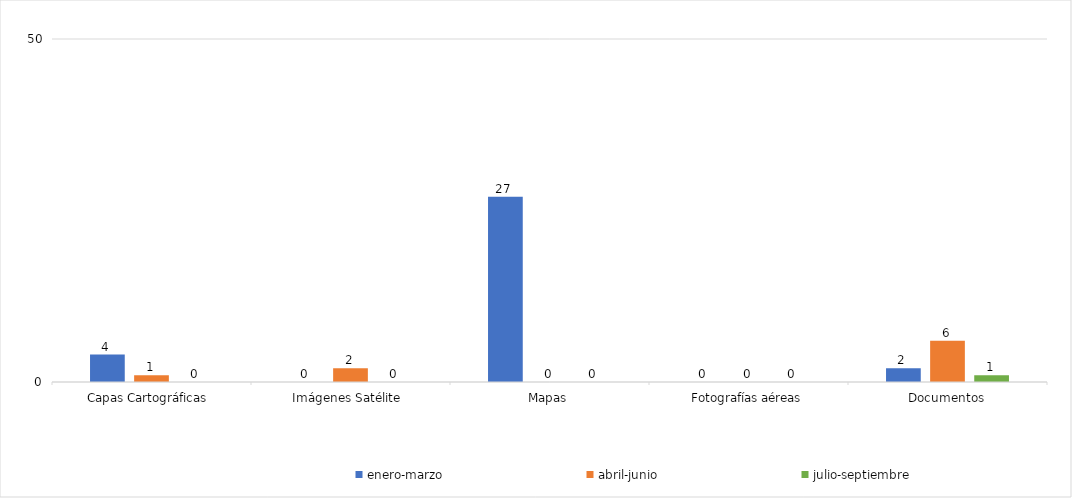
| Category | enero-marzo | abril-junio | julio-septiembre | Series 3 |
|---|---|---|---|---|
| Capas Cartográficas  | 4 | 1 | 0 |  |
| Imágenes Satélite  | 0 | 2 | 0 |  |
| Mapas | 27 | 0 | 0 |  |
| Fotografías aéreas | 0 | 0 | 0 |  |
| Documentos | 2 | 6 | 1 |  |